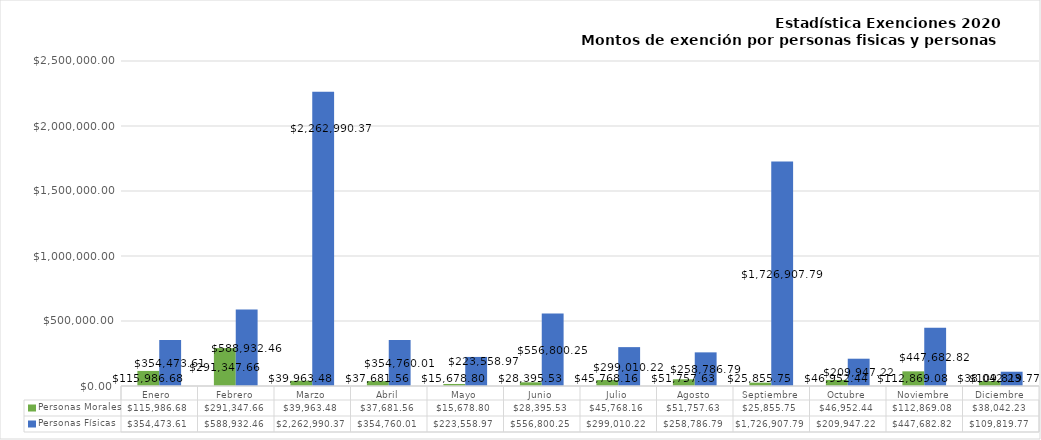
| Category | Personas Morales | Personas Físicas |
|---|---|---|
| Enero  | 115986.68 | 354473.61 |
| Febrero | 291347.66 | 588932.46 |
| Marzo | 39963.48 | 2262990.37 |
| Abril | 37681.56 | 354760.01 |
| Mayo | 15678.8 | 223558.97 |
| Junio | 28395.53 | 556800.25 |
| Julio | 45768.16 | 299010.22 |
| Agosto | 51757.63 | 258786.79 |
| Septiembre | 25855.75 | 1726907.79 |
| Octubre | 46952.44 | 209947.22 |
| Noviembre | 112869.08 | 447682.82 |
| Diciembre | 38042.23 | 109819.77 |